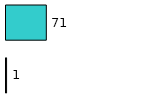
| Category | Series 0 | Series 1 |
|---|---|---|
| 0 | 1 | 71 |